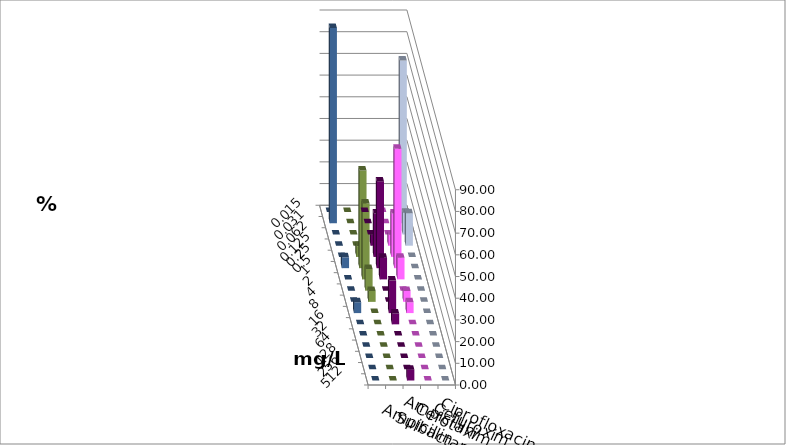
| Category | Ampicillin | Ampicillin/ Sulbactam | Cefotaxim | Cefuroxim | Ciprofloxacin |
|---|---|---|---|---|---|
| 0.015 | 0 | 0 | 0 | 0 | 0 |
| 0.031 | 0 | 0 | 75 | 0 | 90 |
| 0.062 | 0 | 0 | 10 | 0 | 0 |
| 0.125 | 5 | 5 | 15 | 0 | 0 |
| 0.25 | 20 | 20 | 0 | 5 | 0 |
| 0.5 | 40 | 55 | 0 | 45 | 5 |
| 1.0 | 10 | 10 | 0 | 35 | 0 |
| 2.0 | 0 | 0 | 0 | 10 | 0 |
| 4.0 | 0 | 5 | 0 | 5 | 0 |
| 8.0 | 15 | 5 | 0 | 0 | 5 |
| 16.0 | 5 | 0 | 0 | 0 | 0 |
| 32.0 | 0 | 0 | 0 | 0 | 0 |
| 64.0 | 0 | 0 | 0 | 0 | 0 |
| 128.0 | 0 | 0 | 0 | 0 | 0 |
| 256.0 | 0 | 0 | 0 | 0 | 0 |
| 512.0 | 5 | 0 | 0 | 0 | 0 |